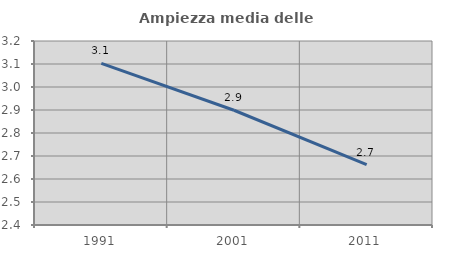
| Category | Ampiezza media delle famiglie |
|---|---|
| 1991.0 | 3.103 |
| 2001.0 | 2.899 |
| 2011.0 | 2.662 |